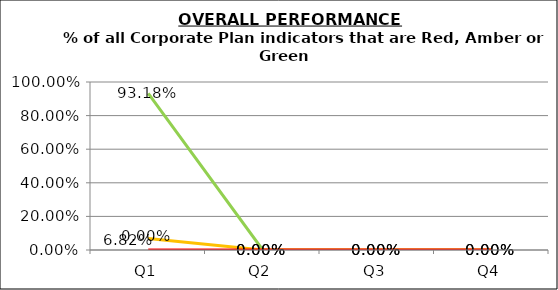
| Category | Green | Amber | Red |
|---|---|---|---|
| Q1 | 0.932 | 0.068 | 0 |
| Q2 | 0 | 0 | 0 |
| Q3 | 0 | 0 | 0 |
| Q4 | 0 | 0 | 0 |